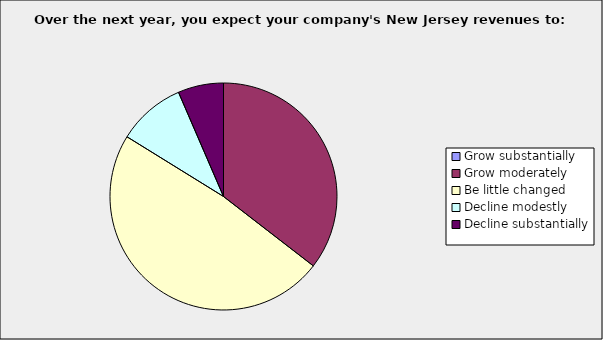
| Category | Series 0 |
|---|---|
| Grow substantially | 0 |
| Grow moderately | 0.355 |
| Be little changed | 0.484 |
| Decline modestly | 0.097 |
| Decline substantially | 0.065 |